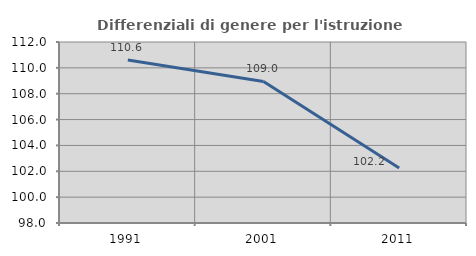
| Category | Differenziali di genere per l'istruzione superiore |
|---|---|
| 1991.0 | 110.611 |
| 2001.0 | 108.951 |
| 2011.0 | 102.246 |